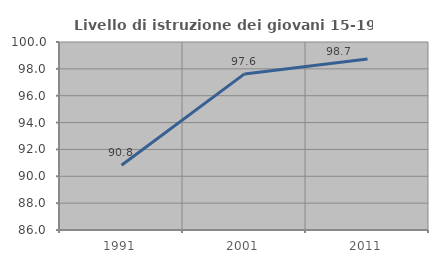
| Category | Livello di istruzione dei giovani 15-19 anni |
|---|---|
| 1991.0 | 90.82 |
| 2001.0 | 97.625 |
| 2011.0 | 98.741 |